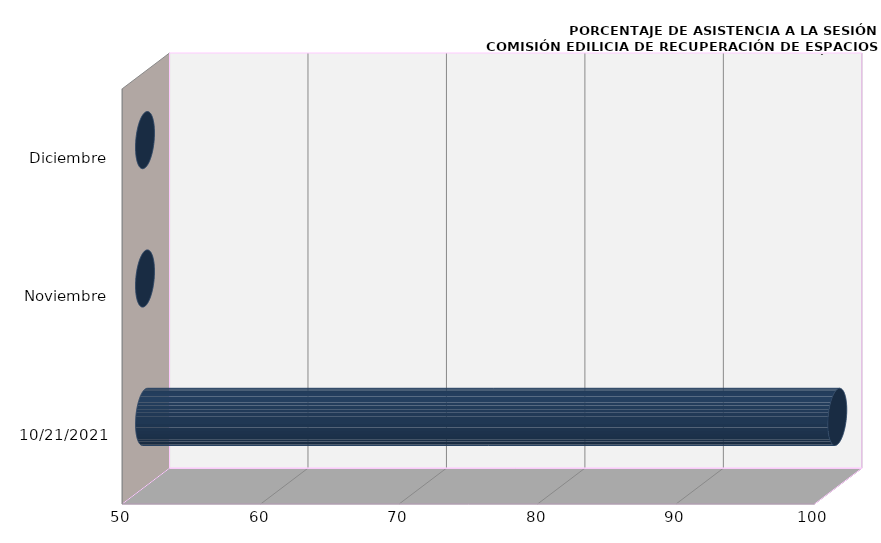
| Category | Series 0 |
|---|---|
| 21/10/2021 | 100 |
| Noviembre | 0 |
| Diciembre | 0 |